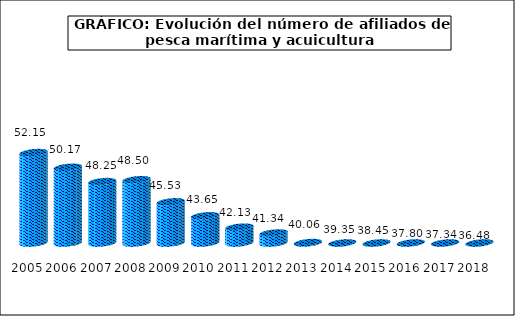
| Category | Series1 |
|---|---|
| 2005.0 | 52.15 |
| 2006.0 | 50.17 |
| 2007.0 | 48.25 |
| 2008.0 | 48.5 |
| 2009.0 | 45.53 |
| 2010.0 | 43.65 |
| 2011.0 | 42.13 |
| 2012.0 | 41.34 |
| 2013.0 | 40.06 |
| 2014.0 | 39.35 |
| 2015.0 | 38.45 |
| 2016.0 | 37.8 |
| 2017.0 | 37.34 |
| 2018.0 | 36.48 |